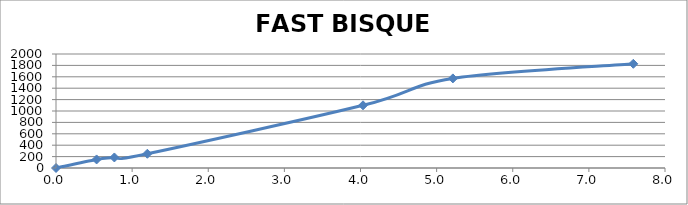
| Category | FAST BISQUE CHART |
|---|---|
| 0.0 | 0 |
| 0.533333333333333 | 150 |
| 0.766666666666667 | 185 |
| 1.2 | 250 |
| 4.033333333333333 | 1100 |
| 5.213333333333332 | 1572 |
| 7.583703703703703 | 1828 |